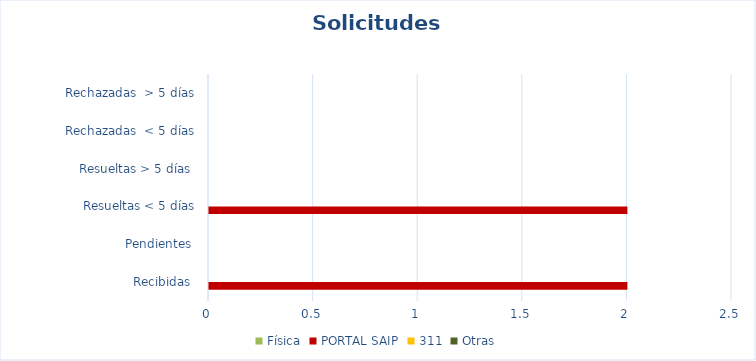
| Category | Física | PORTAL SAIP | 311 | Otras |
|---|---|---|---|---|
| Recibidas  | 0 | 2 | 0 | 0 |
| Pendientes  | 0 | 0 | 0 | 0 |
| Resueltas < 5 días | 0 | 2 | 0 | 0 |
| Resueltas > 5 días  | 0 | 0 | 0 | 0 |
| Rechazadas  < 5 días | 0 | 0 | 0 | 0 |
| Rechazadas  > 5 días | 0 | 0 | 0 | 0 |